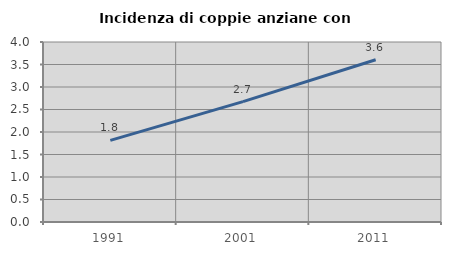
| Category | Incidenza di coppie anziane con figli |
|---|---|
| 1991.0 | 1.813 |
| 2001.0 | 2.676 |
| 2011.0 | 3.606 |